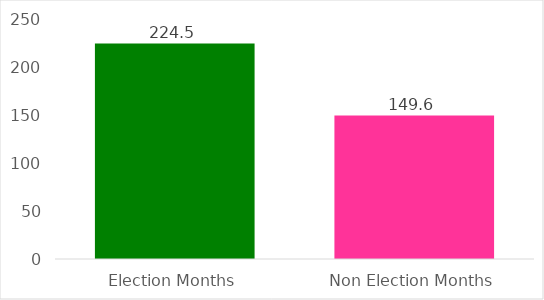
| Category | Average Amont per Month |
|---|---|
| Election Months | 224.5 |
| Non Election Months | 149.57 |